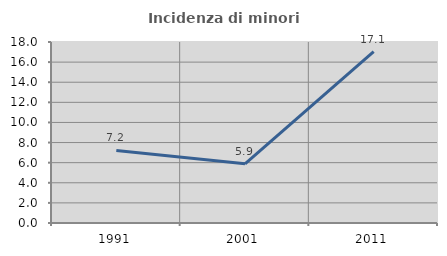
| Category | Incidenza di minori stranieri |
|---|---|
| 1991.0 | 7.216 |
| 2001.0 | 5.882 |
| 2011.0 | 17.053 |